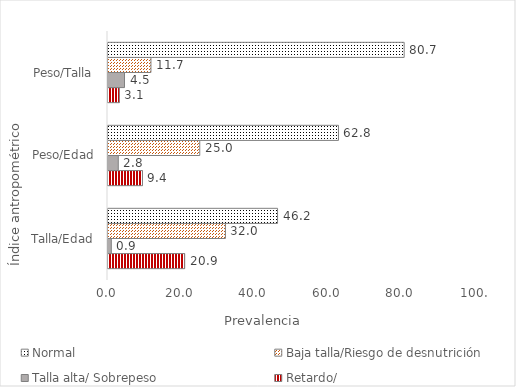
| Category | Retardo/
Desnutrición | Talla alta/ Sobrepeso  | Baja talla/Riesgo de desnutrición | Normal |
|---|---|---|---|---|
| Talla/Edad | 20.9 | 0.9 | 32 | 46.2 |
| Peso/Edad | 9.4 | 2.8 | 25 | 62.8 |
| Peso/Talla | 3.1 | 4.5 | 11.7 | 80.7 |